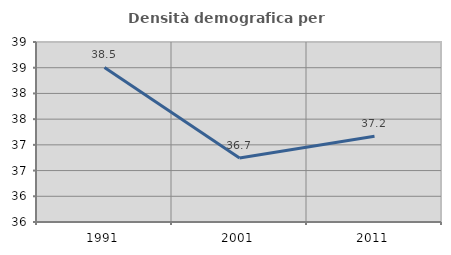
| Category | Densità demografica |
|---|---|
| 1991.0 | 38.506 |
| 2001.0 | 36.743 |
| 2011.0 | 37.168 |